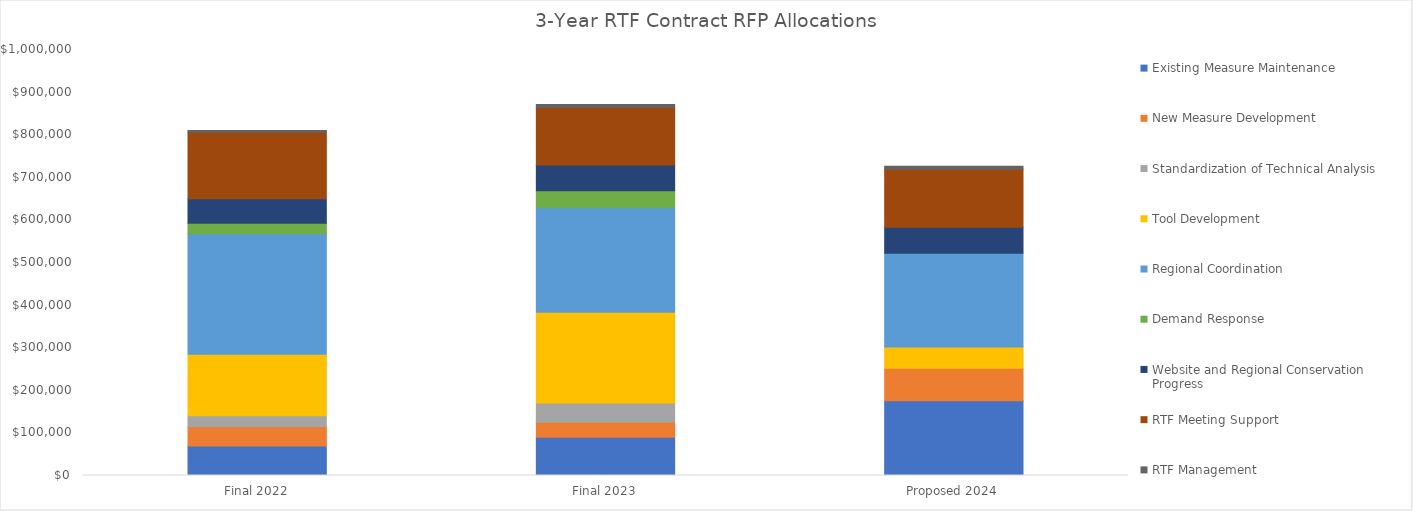
| Category | Existing Measure Maintenance | New Measure Development | Standardization of Technical Analysis | Tool Development | Regional Coordination | Demand Response | Website and Regional Conservation Progress | RTF Meeting Support | RTF Management |
|---|---|---|---|---|---|---|---|---|---|
| Final 2022 | 69000 | 46000 | 25000 | 144500 | 283200 | 24500 | 57400 | 156000 | 4000 |
| Final 2023 | 90000 | 35000 | 45000 | 213300 | 245000 | 40000 | 60800 | 135000 | 7000 |
| Proposed 2024 | 175200 | 76621 | 0 | 50000 | 220000 | 0 | 61200 | 136000 | 7000 |